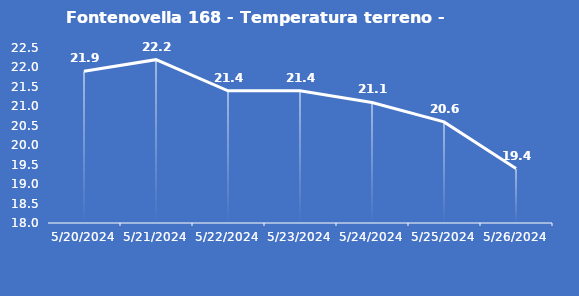
| Category | Fontenovella 168 - Temperatura terreno - Grezzo (°C) |
|---|---|
| 5/20/24 | 21.9 |
| 5/21/24 | 22.2 |
| 5/22/24 | 21.4 |
| 5/23/24 | 21.4 |
| 5/24/24 | 21.1 |
| 5/25/24 | 20.6 |
| 5/26/24 | 19.4 |